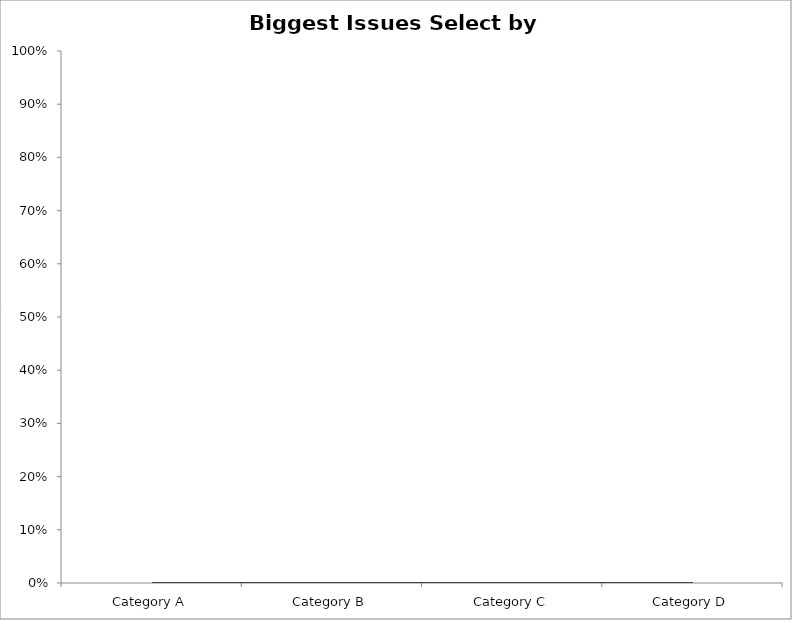
| Category | Percent |
|---|---|
| Category A | 0 |
| Category B | 0 |
| Category C | 0 |
| Category D | 0 |